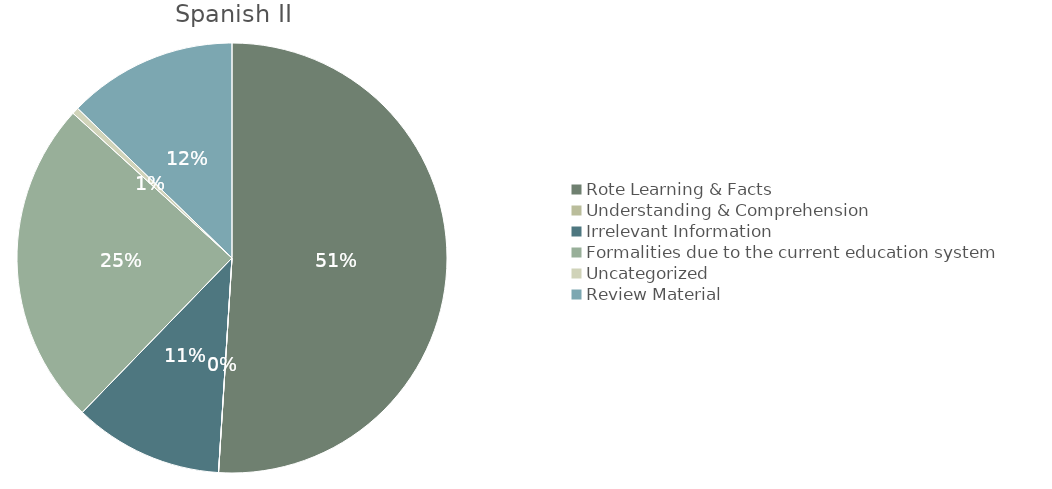
| Category | Spanish |
|---|---|
| Rote Learning & Facts | 25.5 |
| Understanding & Comprehension | 0 |
| Irrelevant Information  | 5.625 |
| Formalities due to the current education system | 12.25 |
| Uncategorized | 0.25 |
| Review Material | 6.375 |